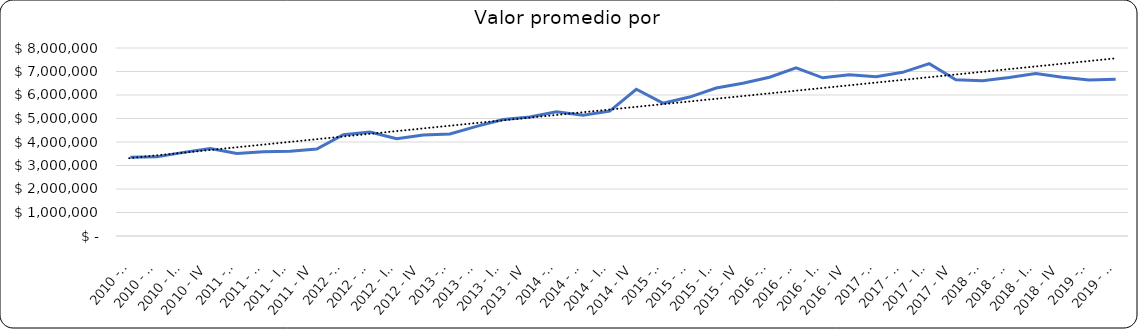
| Category | Valor m2 en Bogotá por sectores |
|---|---|
| 2010 - I | 3353603.604 |
| 2010 - II | 3367117.117 |
| 2010 - III | 3558558.559 |
| 2010 - IV | 3727477.477 |
| 2011 - I | 3513513.514 |
| 2011 - II | 3581081.081 |
| 2011 - III | 3601351.351 |
| 2011 - IV | 3698198.198 |
| 2012 - I | 4312354.312 |
| 2012 - II | 4428174.777 |
| 2012 - III | 4137529.138 |
| 2012 - IV | 4300314.685 |
| 2013 - I | 4339506.173 |
| 2013 - II | 4662962.963 |
| 2013 - III | 4956790.123 |
| 2013 - IV | 5061728.395 |
| 2014 - I | 5284273.983 |
| 2014 - II | 5135555.556 |
| 2014 - III | 5311111.111 |
| 2014 - IV | 6244444.444 |
| 2015 - I | 5654008.439 |
| 2015 - II | 5911392.405 |
| 2015 - III | 6295800.131 |
| 2015 - IV | 6500000 |
| 2016 - I | 6753812.636 |
| 2016 - II | 7154471.545 |
| 2016 - III | 6732426.304 |
| 2016 - IV | 6863289.76 |
| 2017 - I | 6781609.195 |
| 2017 - II | 6964205.817 |
| 2017 - III | 7333333.333 |
| 2017 - IV | 6647597.254 |
| 2018 - I | 6602941.176 |
| 2018 - II | 6744966.443 |
| 2018 - III | 6917808 |
| 2018 - IV | 6758621 |
| 2019 - I | 6643357 |
| 2019 - II | 6672414 |